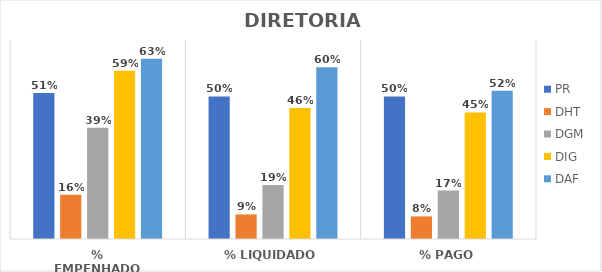
| Category | PR | DHT | DGM | DIG | DAF |
|---|---|---|---|---|---|
| % EMPENHADO | 0.513 | 0.155 | 0.391 | 0.591 | 0.634 |
| % LIQUIDADO | 0.501 | 0.086 | 0.19 | 0.461 | 0.604 |
| % PAGO | 0.501 | 0.079 | 0.17 | 0.445 | 0.522 |